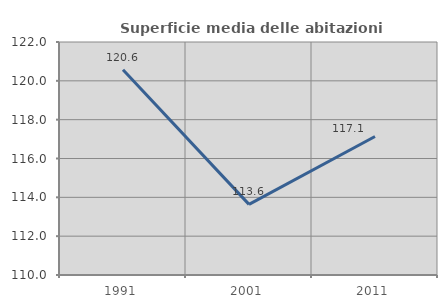
| Category | Superficie media delle abitazioni occupate |
|---|---|
| 1991.0 | 120.572 |
| 2001.0 | 113.638 |
| 2011.0 | 117.134 |